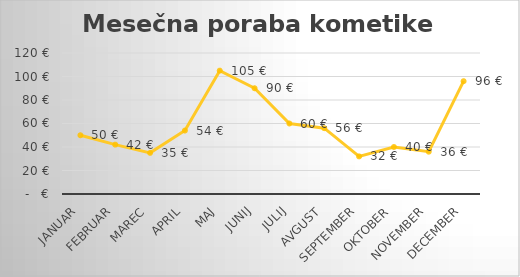
| Category | Series 0 |
|---|---|
| januar | 50 |
| februar | 42 |
| marec | 35 |
| april | 54 |
| maj | 105 |
| junij | 90 |
| julij | 60 |
| avgust | 56 |
| september | 32 |
| oktober | 40 |
| november | 36 |
| december | 96 |